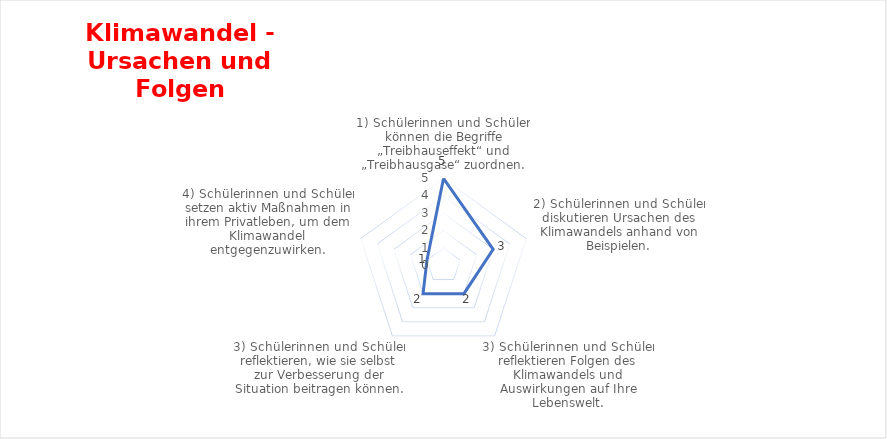
| Category | Series 0 |
|---|---|
| 1) Schülerinnen und Schüler  können die Begriffe „Treibhauseffekt“ und „Treibhausgase“ zuordnen. | 5 |
| 2) Schülerinnen und Schüler diskutieren Ursachen des Klimawandels anhand von Beispielen. | 3 |
| 3) Schülerinnen und Schüler reflektieren Folgen des Klimawandels und Auswirkungen auf Ihre Lebenswelt. | 2 |
| 3) Schülerinnen und Schüler reflektieren, wie sie selbst zur Verbesserung der Situation beitragen können. | 2 |
| 4) Schülerinnen und Schüler setzen aktiv Maßnahmen in ihrem Privatleben, um dem Klimawandel entgegenzuwirken. | 1 |